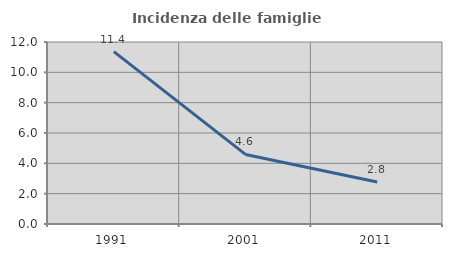
| Category | Incidenza delle famiglie numerose |
|---|---|
| 1991.0 | 11.366 |
| 2001.0 | 4.587 |
| 2011.0 | 2.769 |